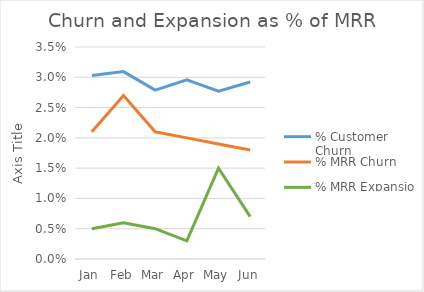
| Category | % Customer Churn | % MRR Churn | % MRR Expansion |
|---|---|---|---|
| Jan | 0.03 | 0.021 | 0.005 |
| Feb | 0.031 | 0.027 | 0.006 |
| Mar | 0.028 | 0.021 | 0.005 |
| Apr | 0.03 | 0.02 | 0.003 |
| May | 0.028 | 0.019 | 0.015 |
| Jun | 0.029 | 0.018 | 0.007 |